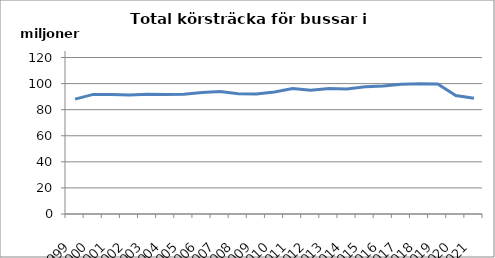
| Category | Series 0 |
|---|---|
| 1999.0 | 88068745.8 |
| 2000.0 | 91705466.2 |
| 2001.0 | 91658398.3 |
| 2002.0 | 91307116.6 |
| 2003.0 | 91810402.3 |
| 2004.0 | 91551523.5 |
| 2005.0 | 91821421.8 |
| 2006.0 | 93208075.7 |
| 2007.0 | 93942192.9 |
| 2008.0 | 92253430.3 |
| 2009.0 | 92055071.1 |
| 2010.0 | 93610479.4 |
| 2011.0 | 96220058.7 |
| 2012.0 | 94929589.9 |
| 2013.0 | 96275326 |
| 2014.0 | 95853494.1 |
| 2015.0 | 97499011.5 |
| 2016.0 | 98203637.1 |
| 2017.0 | 99463592.8 |
| 2018.0 | 99879373 |
| 2019.0 | 99613542 |
| 2020.0 | 90891250 |
| 2021.0 | 88706874.9 |